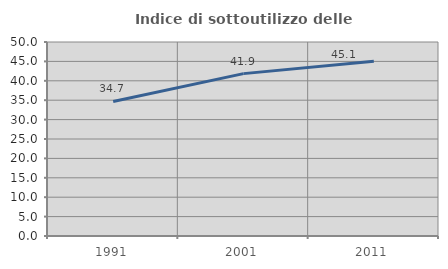
| Category | Indice di sottoutilizzo delle abitazioni  |
|---|---|
| 1991.0 | 34.673 |
| 2001.0 | 41.85 |
| 2011.0 | 45.061 |